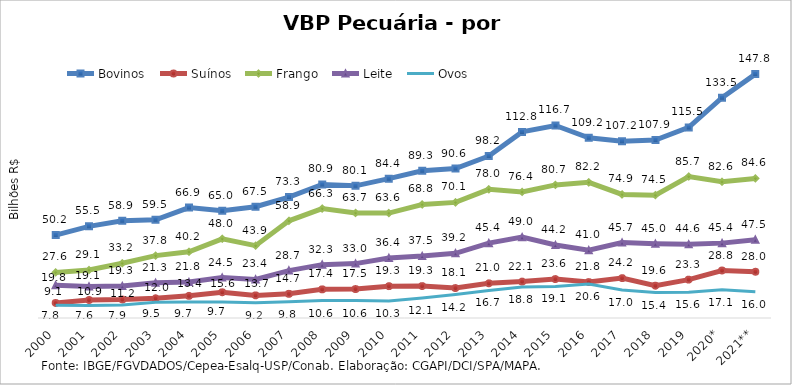
| Category | Bovinos | Suínos | Frango | Leite | Ovos |
|---|---|---|---|---|---|
| 2000 | 50.237 | 9.096 | 27.643 | 19.843 | 7.758 |
| 2001 | 55.532 | 10.913 | 29.055 | 19.094 | 7.645 |
| 2002 | 58.93 | 11.185 | 33.165 | 19.335 | 7.877 |
| 2003 | 59.476 | 11.954 | 37.811 | 21.292 | 9.528 |
| 2004 | 66.917 | 13.44 | 40.15 | 21.761 | 9.657 |
| 2005 | 64.967 | 15.582 | 48.002 | 24.475 | 9.722 |
| 2006 | 67.452 | 13.707 | 43.852 | 23.378 | 9.235 |
| 2007 | 73.304 | 14.657 | 58.92 | 28.74 | 9.815 |
| 2008 | 80.937 | 17.355 | 66.324 | 32.33 | 10.6 |
| 2009 | 80.092 | 17.543 | 63.681 | 32.961 | 10.569 |
| 2010 | 84.441 | 19.299 | 63.604 | 36.401 | 10.28 |
| 2011 | 89.268 | 19.329 | 68.791 | 37.525 | 12.113 |
| 2012 | 90.598 | 18.149 | 70.075 | 39.212 | 14.199 |
| 2013 | 98.176 | 21.014 | 77.994 | 45.377 | 16.7 |
| 2014 | 112.787 | 22.072 | 76.416 | 49.001 | 18.763 |
| 2015 | 116.669 | 23.588 | 80.672 | 44.231 | 19.105 |
| 2016 | 109.207 | 21.768 | 82.199 | 41.042 | 20.596 |
| 2017 | 107.168 | 24.165 | 74.869 | 45.729 | 16.977 |
| 2018 | 107.886 | 19.57 | 74.461 | 45.049 | 15.438 |
| 2019 | 115.522 | 23.261 | 85.734 | 44.632 | 15.635 |
| 2020* | 133.512 | 28.781 | 82.606 | 45.378 | 17.106 |
| 2021** | 147.816 | 28.031 | 84.592 | 47.479 | 15.967 |